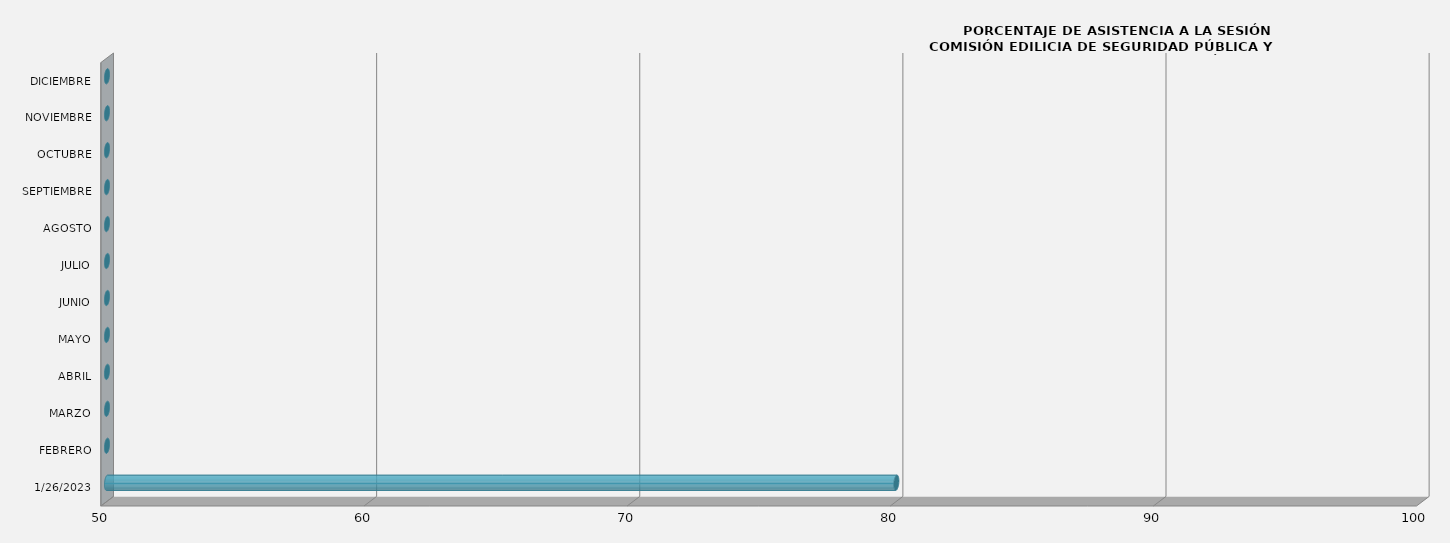
| Category | 1/26/2023 |
|---|---|
| 1/26/2023 | 80 |
| FEBRERO | 0 |
| MARZO | 0 |
| ABRIL | 0 |
| MAYO | 0 |
| JUNIO | 0 |
| JULIO | 0 |
| AGOSTO | 0 |
| SEPTIEMBRE | 0 |
| OCTUBRE | 0 |
| NOVIEMBRE | 0 |
| DICIEMBRE | 0 |